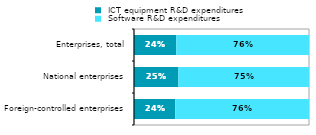
| Category |  ICT equipment R&D expenditures |  Software R&D expenditures |
|---|---|---|
|  Foreign-controlled enterprises | 0.236 | 0.764 |
|  National enterprises | 0.254 | 0.746 |
|  Enterprises, total | 0.242 | 0.758 |